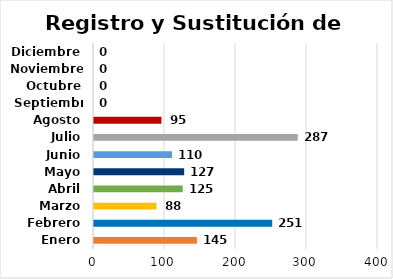
| Category | Registro y Sustitución de Firmas |
|---|---|
| Enero | 145 |
| Febrero | 251 |
| Marzo | 88 |
| Abril | 125 |
| Mayo | 127 |
| Junio | 110 |
| Julio | 287 |
| Agosto | 95 |
| Septiembre | 0 |
| Octubre | 0 |
| Noviembre | 0 |
| Diciembre | 0 |